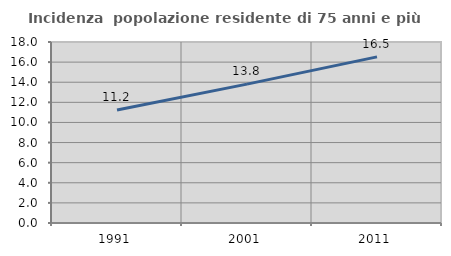
| Category | Incidenza  popolazione residente di 75 anni e più |
|---|---|
| 1991.0 | 11.241 |
| 2001.0 | 13.808 |
| 2011.0 | 16.519 |